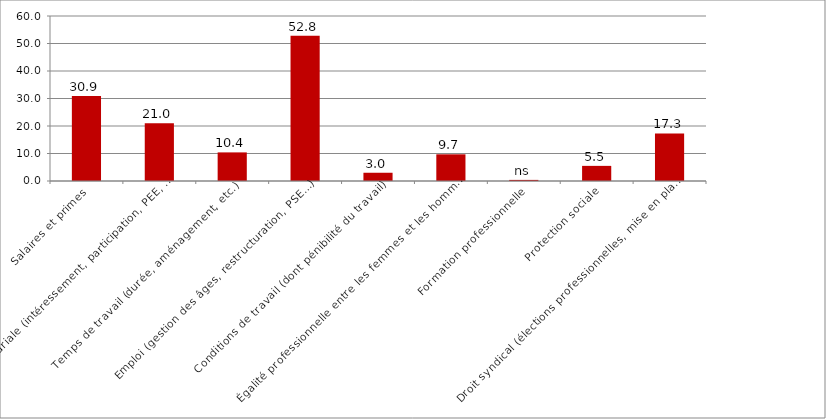
| Category | Series 0 |
|---|---|
| Salaires et primes | 30.9 |
| Épargne salariale (intéressement, participation, PEE, etc.) | 21 |
| Temps de travail (durée, aménagement, etc.) | 10.4 |
| Emploi (gestion des âges, restructuration, PSE…) | 52.8 |
| Conditions de travail (dont pénibilité du travail) | 3 |
| Égalité professionnelle entre les femmes et les hommes  | 9.7 |
| Formation professionnelle | 0.4 |
| Protection sociale | 5.5 |
| Droit syndical (élections professionnelles, mise en place d’un CSE, formation et accompagnement des élus, BDES, etc.) | 17.3 |